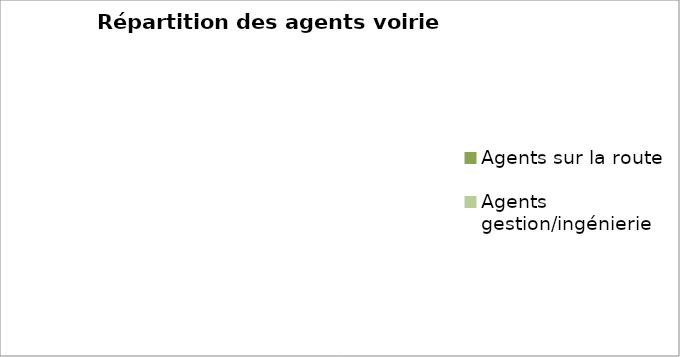
| Category | Series 0 |
|---|---|
| Agents sur la route | 0 |
| Agents gestion/ingénierie | 0 |